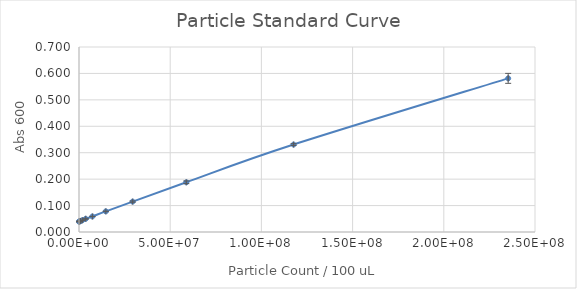
| Category | Series 0 |
|---|---|
| 235294117.64705887 | 0.581 |
| 117647058.82352944 | 0.331 |
| 58823529.41176472 | 0.188 |
| 29411764.70588236 | 0.115 |
| 14705882.35294118 | 0.078 |
| 7352941.17647059 | 0.059 |
| 3676470.588235295 | 0.05 |
| 1838235.2941176475 | 0.044 |
| 919117.6470588237 | 0.042 |
| 459558.82352941186 | 0.041 |
| 229779.41176470593 | 0.04 |
| 0.0 | 0.039 |